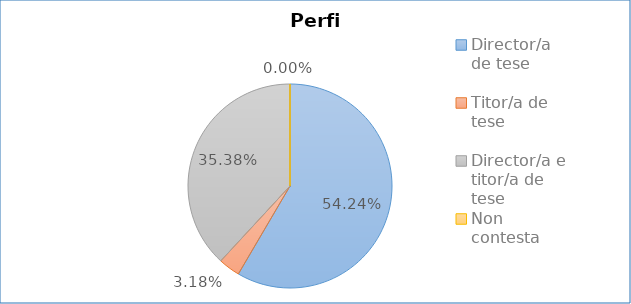
| Category | Perfil |
|---|---|
| Director/a de tese | 0.542 |
| Titor/a de tese | 0.032 |
| Director/a e titor/a de tese | 0.354 |
| Non contesta | 0 |